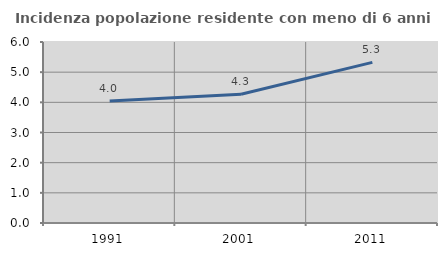
| Category | Incidenza popolazione residente con meno di 6 anni |
|---|---|
| 1991.0 | 4.044 |
| 2001.0 | 4.27 |
| 2011.0 | 5.326 |